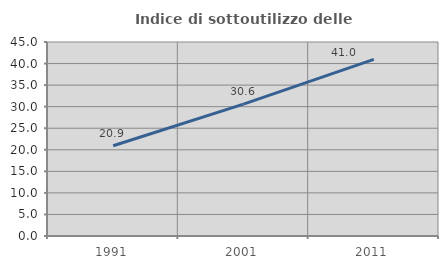
| Category | Indice di sottoutilizzo delle abitazioni  |
|---|---|
| 1991.0 | 20.922 |
| 2001.0 | 30.575 |
| 2011.0 | 40.974 |